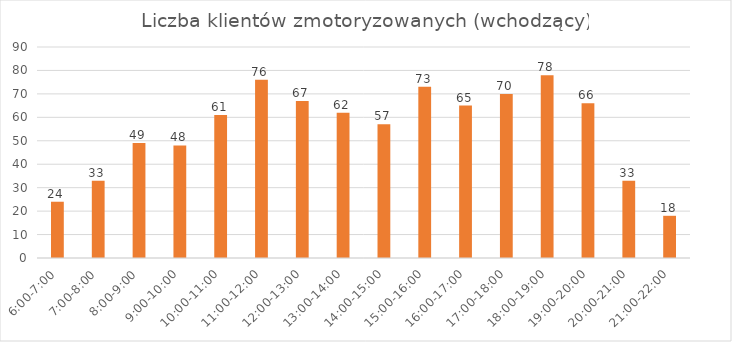
| Category | os/godz |
|---|---|
| 6:00-7:00 | 24 |
| 7:00-8:00 | 33 |
| 8:00-9:00 | 49 |
| 9:00-10:00 | 48 |
| 10:00-11:00 | 61 |
| 11:00-12:00 | 76 |
| 12:00-13:00 | 67 |
| 13:00-14:00 | 62 |
| 14:00-15:00 | 57 |
| 15:00-16:00 | 73 |
| 16:00-17:00 | 65 |
| 17:00-18:00 | 70 |
| 18:00-19:00 | 78 |
| 19:00-20:00 | 66 |
| 20:00-21:00 | 33 |
| 21:00-22:00 | 18 |